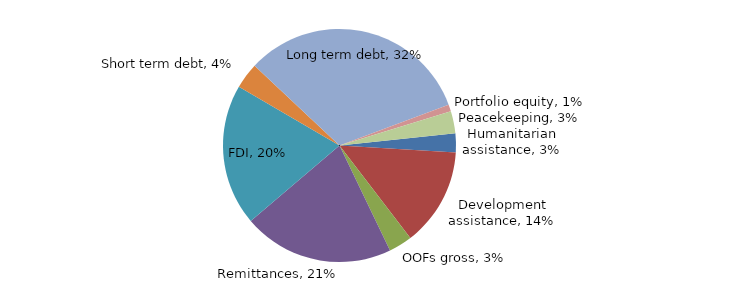
| Category | Series 0 |
|---|---|
| Humanitarian assistance | 0.026 |
| Development assistance | 0.136 |
| OOFs gross | 0.033 |
| Remittances | 0.209 |
| FDI | 0.196 |
| Short term debt | 0.036 |
| Long term debt | 0.323 |
| Portfolio equity | 0.01 |
| Peacekeeping | 0.031 |